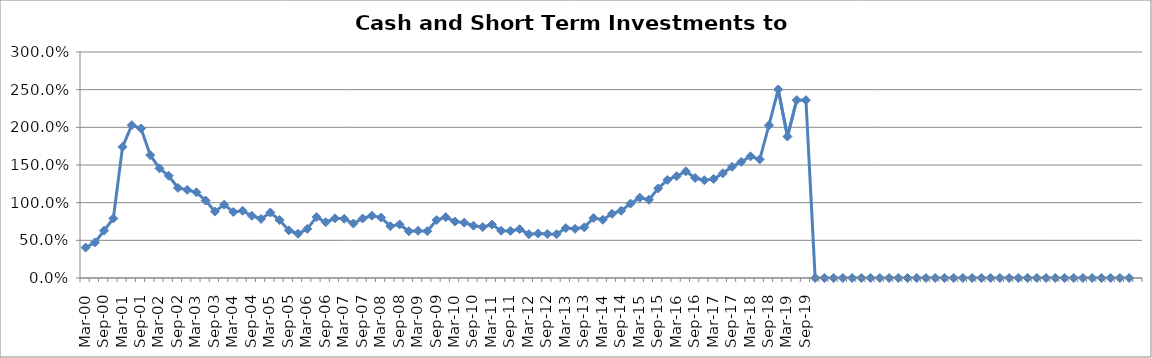
| Category | Cash and Short-Term Investments to Revenue % |
|---|---|
| Mar-00 | 0.404 |
| Jun-00 | 0.472 |
| Sep-00 | 0.628 |
| Dec-00 | 0.79 |
| Mar-01 | 1.741 |
| Jun-01 | 2.029 |
| Sep-01 | 1.985 |
| Dec-01 | 1.631 |
| Mar-02 | 1.455 |
| Jun-02 | 1.357 |
| Sep-02 | 1.196 |
| Dec-02 | 1.17 |
| Mar-03 | 1.138 |
| Jun-03 | 1.028 |
| Sep-03 | 0.882 |
| Dec-03 | 0.973 |
| Mar-04 | 0.876 |
| Jun-04 | 0.893 |
| Sep-04 | 0.826 |
| Dec-04 | 0.784 |
| Mar-05 | 0.869 |
| Jun-05 | 0.769 |
| Sep-05 | 0.632 |
| Dec-05 | 0.587 |
| Mar-06 | 0.652 |
| Jun-06 | 0.808 |
| Sep-06 | 0.74 |
| Dec-06 | 0.792 |
| Mar-07 | 0.786 |
| Jun-07 | 0.723 |
| Sep-07 | 0.79 |
| Dec-07 | 0.827 |
| Mar-08 | 0.802 |
| Jun-08 | 0.688 |
| Sep-08 | 0.711 |
| Dec-08 | 0.621 |
| Mar-09 | 0.626 |
| Jun-09 | 0.622 |
| Sep-09 | 0.77 |
| Dec-09 | 0.808 |
| Mar-10 | 0.749 |
| Jun-10 | 0.735 |
| Sep-10 | 0.695 |
| Dec-10 | 0.676 |
| Mar-11 | 0.71 |
| Jun-11 | 0.627 |
| Sep-11 | 0.625 |
| Dec-11 | 0.648 |
| Mar-12 | 0.582 |
| Jun-12 | 0.591 |
| Sep-12 | 0.585 |
| Dec-12 | 0.582 |
| Mar-13 | 0.663 |
| Jun-13 | 0.653 |
| Sep-13 | 0.673 |
| Dec-13 | 0.797 |
| Mar-14 | 0.773 |
| Jun-14 | 0.852 |
| Sep-14 | 0.893 |
| Dec-14 | 0.987 |
| Mar-15 | 1.066 |
| Jun-15 | 1.039 |
| Sep-15 | 1.189 |
| Dec-15 | 1.303 |
| Mar-16 | 1.351 |
| Jun-16 | 1.416 |
| Sep-16 | 1.327 |
| Dec-16 | 1.298 |
| Mar-17 | 1.314 |
| Jun-17 | 1.39 |
| Sep-17 | 1.476 |
| Dec-17 | 1.542 |
| Mar-18 | 1.615 |
| Jun-18 | 1.575 |
| Sep-18 | 2.028 |
| Dec-18 | 2.503 |
| Mar-19 | 1.878 |
| Jun-19 | 2.361 |
| Sep-19 | 2.361 |